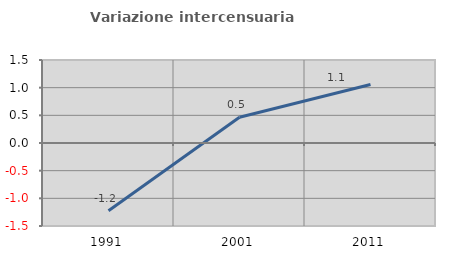
| Category | Variazione intercensuaria annua |
|---|---|
| 1991.0 | -1.223 |
| 2001.0 | 0.466 |
| 2011.0 | 1.056 |